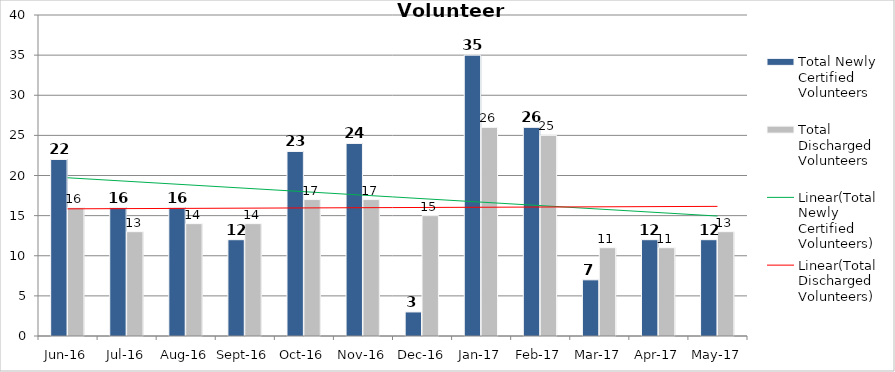
| Category | Total Newly Certified Volunteers | Total Discharged Volunteers |
|---|---|---|
| Jun-16 | 22 | 16 |
| Jul-16 | 16 | 13 |
| Aug-16 | 16 | 14 |
| Sep-16 | 12 | 14 |
| Oct-16 | 23 | 17 |
| Nov-16 | 24 | 17 |
| Dec-16 | 3 | 15 |
| Jan-17 | 35 | 26 |
| Feb-17 | 26 | 25 |
| Mar-17 | 7 | 11 |
| Apr-17 | 12 | 11 |
| May-17 | 12 | 13 |